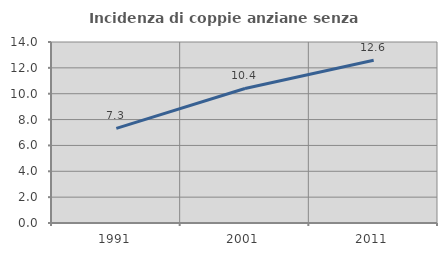
| Category | Incidenza di coppie anziane senza figli  |
|---|---|
| 1991.0 | 7.323 |
| 2001.0 | 10.404 |
| 2011.0 | 12.592 |